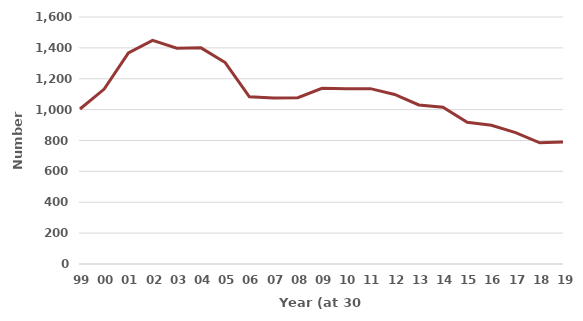
| Category | Number of EGMs at 30 June |
|---|---|
| 99 | 1004 |
| 00 | 1133 |
| 01 | 1368 |
| 02 | 1449 |
| 03 | 1398 |
| 04 | 1400 |
| 05 | 1305 |
| 06 | 1083 |
| 07 | 1075 |
| 08 | 1077 |
| 09 | 1138 |
| 10 | 1135 |
| 11 | 1136 |
| 12 | 1098 |
| 13 | 1030 |
| 14 | 1016 |
| 15 | 918 |
| 16 | 899 |
| 17 | 851 |
| 18 | 785 |
| 19 | 790 |